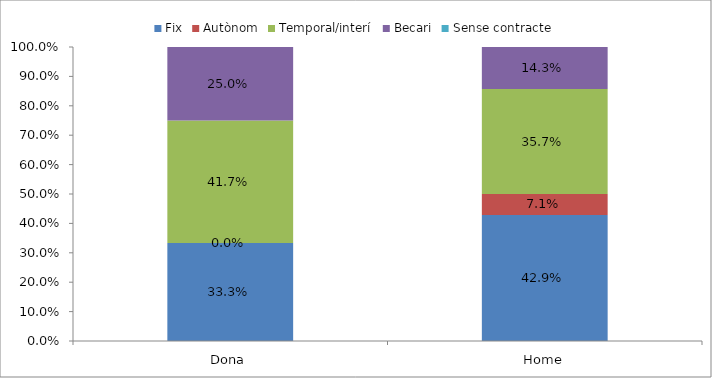
| Category | Fix | Autònom | Temporal/interí | Becari | Sense contracte |
|---|---|---|---|---|---|
| Dona | 0.333 | 0 | 0.417 | 0.25 | 0 |
| Home | 0.429 | 0.071 | 0.357 | 0.143 | 0 |